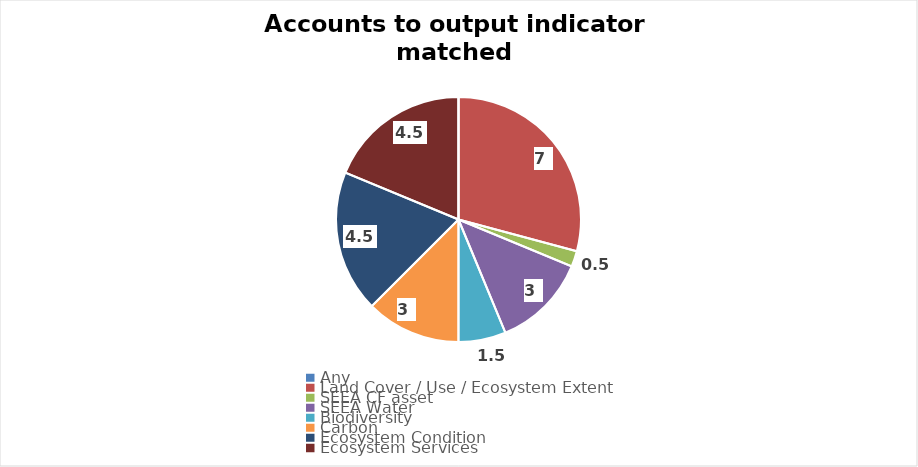
| Category | Series 0 |
|---|---|
| Any | 0 |
| Land Cover / Use / Ecosystem Extent | 7 |
| SEEA CF asset | 0.5 |
| SEEA Water | 3 |
| Biodiversity | 1.5 |
| Carbon | 3 |
| Ecosystem Condition | 4.5 |
| Ecosystem Services | 4.5 |